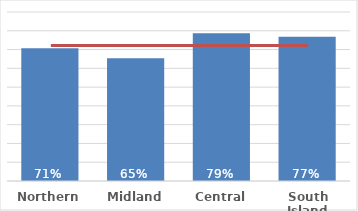
| Category | Pacific |
|---|---|
| Northern | 0.707 |
| Midland | 0.653 |
| Central | 0.787 |
| South Island | 0.768 |